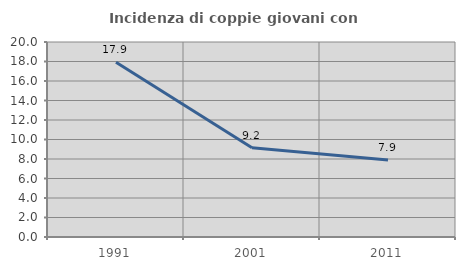
| Category | Incidenza di coppie giovani con figli |
|---|---|
| 1991.0 | 17.925 |
| 2001.0 | 9.16 |
| 2011.0 | 7.908 |